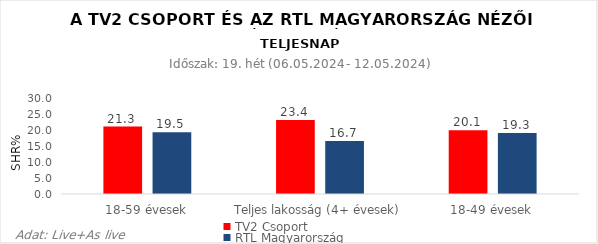
| Category | TV2 Csoport | RTL Magyarország |
|---|---|---|
| 18-59 évesek | 21.3 | 19.5 |
| Teljes lakosság (4+ évesek) | 23.4 | 16.7 |
| 18-49 évesek | 20.1 | 19.3 |